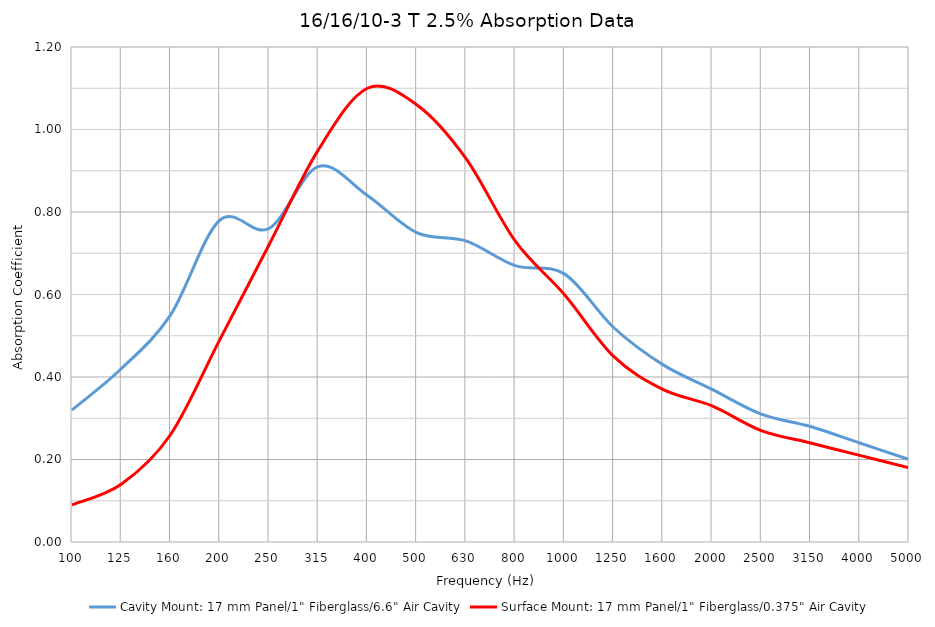
| Category | Cavity Mount: 17 mm Panel/1" Fiberglass/6.6" Air Cavity | Surface Mount: 17 mm Panel/1" Fiberglass/0.375" Air Cavity |
|---|---|---|
| 100.0 | 0.32 | 0.09 |
| 125.0 | 0.42 | 0.14 |
| 160.0 | 0.55 | 0.26 |
| 200.0 | 0.78 | 0.49 |
| 250.0 | 0.76 | 0.72 |
| 315.0 | 0.91 | 0.95 |
| 400.0 | 0.84 | 1.1 |
| 500.0 | 0.75 | 1.06 |
| 630.0 | 0.73 | 0.93 |
| 800.0 | 0.67 | 0.73 |
| 1000.0 | 0.65 | 0.6 |
| 1250.0 | 0.52 | 0.45 |
| 1600.0 | 0.43 | 0.37 |
| 2000.0 | 0.37 | 0.33 |
| 2500.0 | 0.31 | 0.27 |
| 3150.0 | 0.28 | 0.24 |
| 4000.0 | 0.24 | 0.21 |
| 5000.0 | 0.2 | 0.18 |